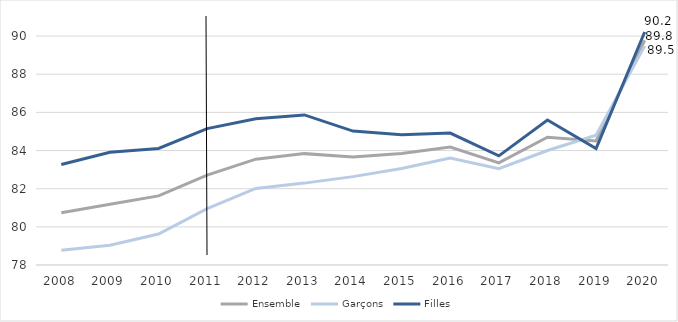
| Category | Ensemble | Garçons | Filles |
|---|---|---|---|
| 2008.0 | 80.734 | 78.772 | 83.267 |
| 2009.0 | 81.187 | 79.035 | 83.912 |
| 2010.0 | 81.622 | 79.621 | 84.109 |
| 2011.0 | 82.716 | 80.953 | 85.151 |
| 2012.0 | 83.548 | 82.011 | 85.664 |
| 2013.0 | 83.838 | 82.293 | 85.868 |
| 2014.0 | 83.664 | 82.633 | 85.02 |
| 2015.0 | 83.841 | 83.062 | 84.823 |
| 2016.0 | 84.188 | 83.601 | 84.917 |
| 2017.0 | 83.352 | 83.044 | 83.721 |
| 2018.0 | 84.7 | 84 | 85.6 |
| 2019.0 | 84.5 | 84.8 | 84.1 |
| 2020.0 | 89.779 | 89.486 | 90.212 |